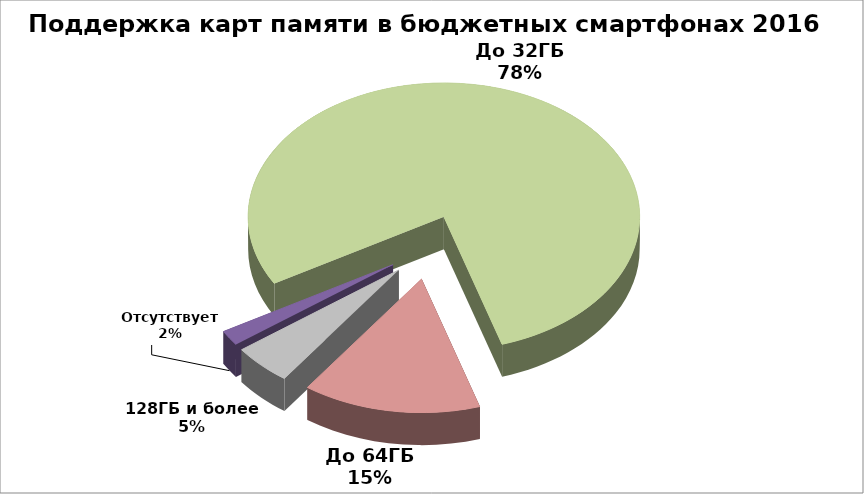
| Category | Series 0 |
|---|---|
| До 32ГБ | 128 |
| До 64ГБ | 24 |
| 128ГБ и более | 8 |
| Отсутствует | 3 |